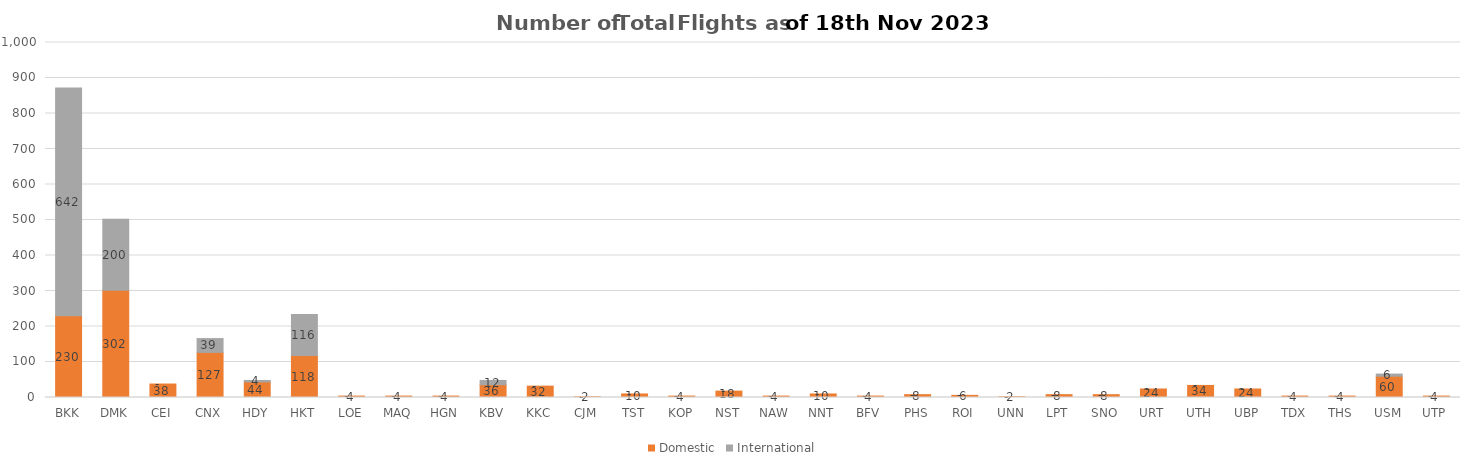
| Category | Domestic | International |
|---|---|---|
| BKK | 230 | 642 |
| DMK | 302 | 200 |
| CEI | 38 | 0 |
| CNX | 127 | 39 |
| HDY | 44 | 4 |
| HKT | 118 | 116 |
| LOE | 4 | 0 |
| MAQ | 4 | 0 |
| HGN | 4 | 0 |
| KBV | 36 | 12 |
| KKC | 32 | 0 |
| CJM | 2 | 0 |
| TST | 10 | 0 |
| KOP | 4 | 0 |
| NST | 18 | 0 |
| NAW | 4 | 0 |
| NNT | 10 | 0 |
| BFV | 4 | 0 |
| PHS | 8 | 0 |
| ROI | 6 | 0 |
| UNN | 2 | 0 |
| LPT | 8 | 0 |
| SNO | 8 | 0 |
| URT | 24 | 0 |
| UTH | 34 | 0 |
| UBP | 24 | 0 |
| TDX | 4 | 0 |
| THS | 4 | 0 |
| USM | 60 | 6 |
| UTP | 4 | 0 |